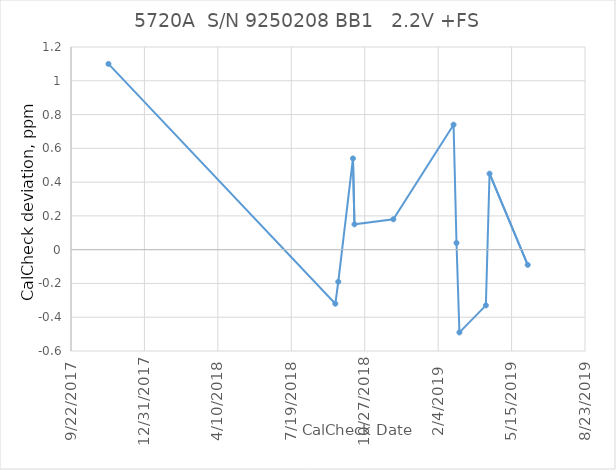
| Category |   2.2V +FS |
|---|---|
| 43051.0 | 1.1 |
| 43360.0 | -0.32 |
| 43364.0 | -0.19 |
| 43384.0 | 0.54 |
| 43386.0 | 0.15 |
| 43439.0 | 0.18 |
| 43521.0 | 0.74 |
| 43525.0 | 0.04 |
| 43529.0 | -0.49 |
| 43565.0 | -0.33 |
| 43570.0 | 0.45 |
| 43622.0 | -0.09 |